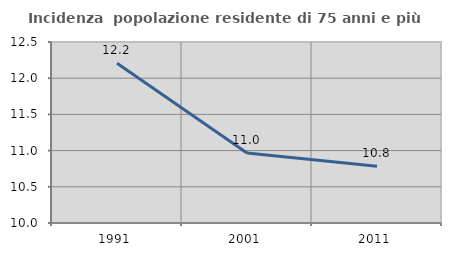
| Category | Incidenza  popolazione residente di 75 anni e più |
|---|---|
| 1991.0 | 12.206 |
| 2001.0 | 10.966 |
| 2011.0 | 10.785 |